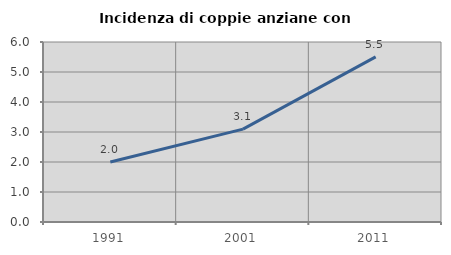
| Category | Incidenza di coppie anziane con figli |
|---|---|
| 1991.0 | 2 |
| 2001.0 | 3.095 |
| 2011.0 | 5.502 |